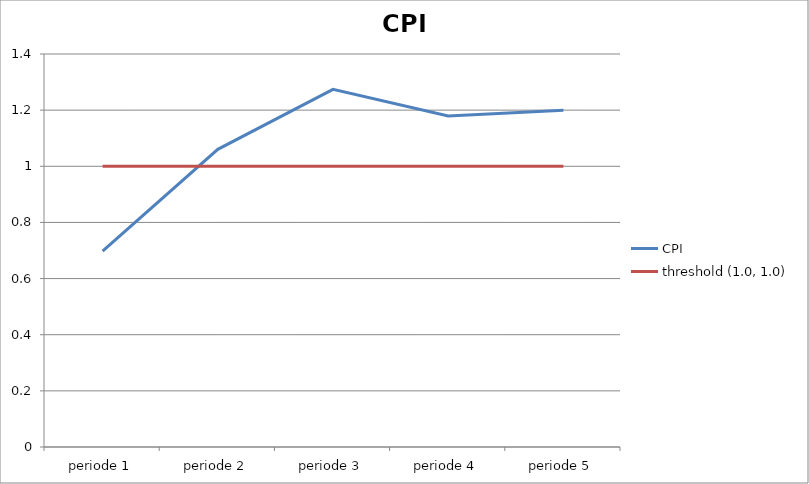
| Category | CPI | threshold (1.0, 1.0) |
|---|---|---|
| periode 1 | 0.698 | 1 |
| periode 2 | 1.06 | 1 |
| periode 3 | 1.274 | 1 |
| periode 4 | 1.179 | 1 |
| periode 5 | 1.199 | 1 |